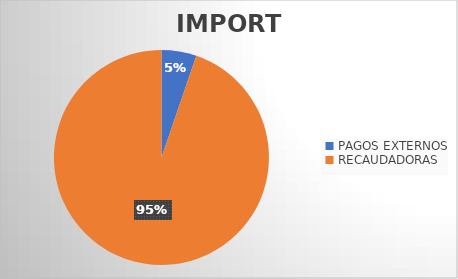
| Category | IMPORTE |
|---|---|
| PAGOS EXTERNOS | 16005407.09 |
| RECAUDADORAS | 288376821.98 |